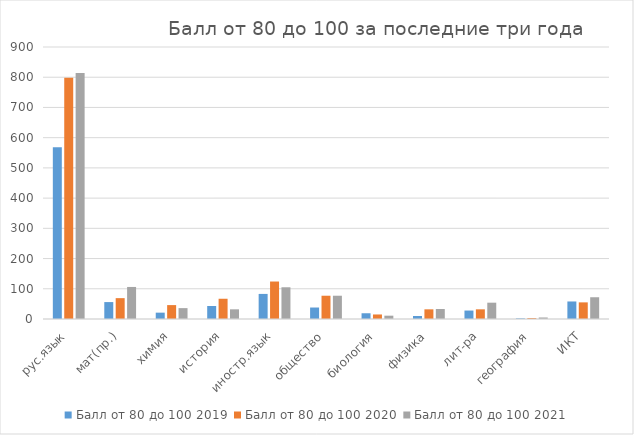
| Category | Балл от 80 до 100 2019 | Балл от 80 до 100 2020 | Балл от 80 до 100 2021 |
|---|---|---|---|
| рус.язык | 568 | 798 | 814 |
| мат(пр.) | 56 | 69 | 106 |
| химия | 21 | 46 | 36 |
| история | 43 | 67 | 32 |
| иностр.язык | 83 | 124 | 105 |
| общество | 38 | 77 | 77 |
| биология | 19 | 15 | 11 |
| физика | 10 | 32 | 33 |
| лит-ра | 28 | 32 | 54 |
| география | 2 | 3 | 5 |
| ИКТ | 58 | 55 | 72 |